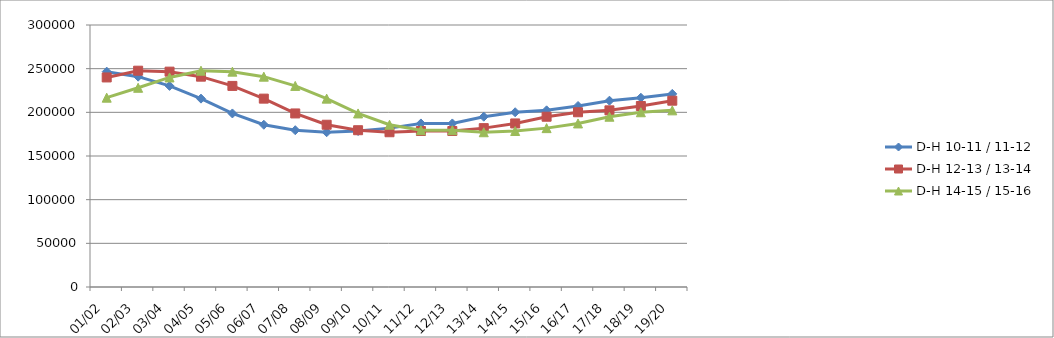
| Category | D-H 10-11 / 11-12 | D-H 12-13 / 13-14 | D-H 14-15 / 15-16 |
|---|---|---|---|
| 01/02 | 246583 | 239956 | 216779 |
| 02/03 | 240844 | 247670 | 228102 |
| 03/04 | 230254 | 246583 | 239956 |
| 04/05 | 215679 | 240844 | 247670 |
| 05/06 | 198719 | 230254 | 246583 |
| 06/07 | 185799 | 215679 | 240844 |
| 07/08 | 179530 | 198719 | 230254 |
| 08/09 | 177201 | 185799 | 215679 |
| 09/10 | 178614 | 179530 | 198719 |
| 10/11 | 181907 | 177201 | 185799 |
| 11/12 | 187281 | 178614 | 179530 |
| 12/13 | 187281 | 178614 | 179530 |
| 13/14 | 194972 | 181907 | 177201 |
| 14/15 | 200085 | 187281 | 178614 |
| 15/16 | 202274 | 194972 | 181907 |
| 16/17 | 207259 | 200085 | 187281 |
| 17/18 | 213334 | 202274 | 194972 |
| 18/19 | 216722 | 207259 | 200085 |
| 19/20 | 221102 | 213334 | 202274 |